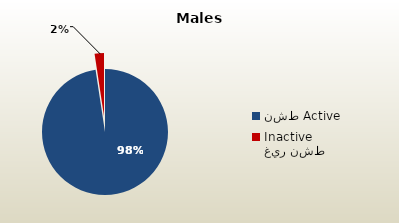
| Category | الذكور غير القطريين  Non-Qatari Males |
|---|---|
| نشط Active | 1673766 |
| غير نشط Inactive | 41131 |